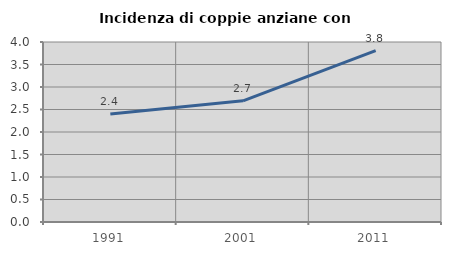
| Category | Incidenza di coppie anziane con figli |
|---|---|
| 1991.0 | 2.399 |
| 2001.0 | 2.693 |
| 2011.0 | 3.809 |